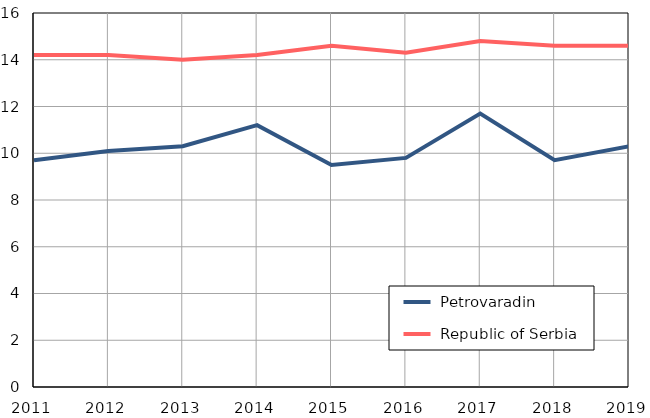
| Category |  Petrovaradin |  Republic of Serbia |
|---|---|---|
| 2011.0 | 9.7 | 14.2 |
| 2012.0 | 10.1 | 14.2 |
| 2013.0 | 10.3 | 14 |
| 2014.0 | 11.2 | 14.2 |
| 2015.0 | 9.5 | 14.6 |
| 2016.0 | 9.8 | 14.3 |
| 2017.0 | 11.7 | 14.8 |
| 2018.0 | 9.7 | 14.6 |
| 2019.0 | 10.3 | 14.6 |